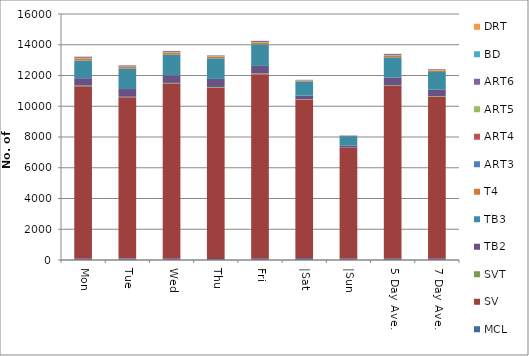
| Category | MCL | SV | SVT | TB2 | TB3 | T4 | ART3 | ART4 | ART5 | ART6 | BD | DRT |
|---|---|---|---|---|---|---|---|---|---|---|---|---|
| Mon | 78 | 11217 | 54 | 475 | 1145 | 130 | 5 | 13 | 33 | 63 | 6 | 18 |
| Tue | 92 | 10494 | 35 | 498 | 1327 | 105 | 2 | 18 | 23 | 62 | 7 | 8 |
| Wed | 85 | 11387 | 47 | 491 | 1345 | 132 | 8 | 7 | 28 | 57 | 7 | 10 |
| Thu | 64 | 11141 | 49 | 526 | 1336 | 101 | 5 | 9 | 25 | 46 | 9 | 8 |
| Fri | 86 | 11996 | 52 | 490 | 1402 | 111 | 5 | 9 | 28 | 64 | 7 | 8 |
| |Sat | 121 | 10290 | 42 | 236 | 928 | 48 | 4 | 6 | 15 | 24 | 3 | 7 |
| |Sun | 80 | 7205 | 20 | 148 | 607 | 21 | 3 | 2 | 9 | 15 | 1 | 2 |
| 5 Day Ave. | 81 | 11247 | 47 | 496 | 1311 | 116 | 5 | 11 | 27 | 58 | 7 | 10 |
| 7 Day Ave. | 87 | 10533 | 43 | 409 | 1156 | 93 | 5 | 9 | 23 | 47 | 6 | 9 |